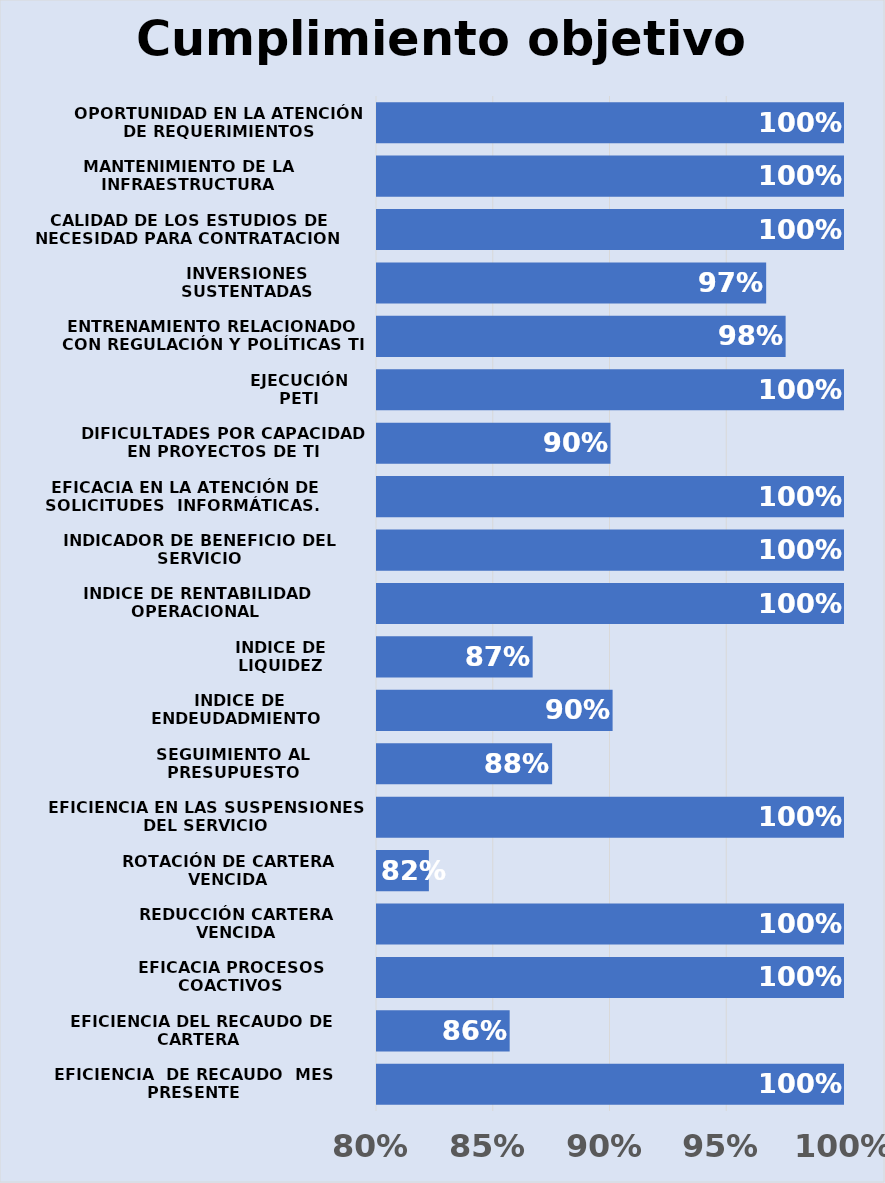
| Category | Series 0 |
|---|---|
| EFICIENCIA  DE RECAUDO  MES PRESENTE | 1 |
| EFICIENCIA DEL RECAUDO DE CARTERA  | 0.857 |
| EFICACIA PROCESOS COACTIVOS | 1 |
| REDUCCIÓN CARTERA VENCIDA | 1 |
| ROTACIÓN DE CARTERA VENCIDA | 0.822 |
| EFICIENCIA EN LAS SUSPENSIONES DEL SERVICIO | 1 |
| SEGUIMIENTO AL PRESUPUESTO | 0.875 |
| INDICE DE ENDEUDADMIENTO  | 0.901 |
| INDICE DE LIQUIDEZ | 0.867 |
| INDICE DE RENTABILIDAD OPERACIONAL  | 1 |
| INDICADOR DE BENEFICIO DEL SERVICIO | 1 |
| EFICACIA EN LA ATENCIÓN DE SOLICITUDES  INFORMÁTICAS.  | 1 |
| DIFICULTADES POR CAPACIDAD EN PROYECTOS DE TI | 0.9 |
| EJECUCIÓN PETI | 1 |
| ENTRENAMIENTO RELACIONADO CON REGULACIÓN Y POLÍTICAS TI | 0.975 |
| INVERSIONES SUSTENTADAS | 0.967 |
| CALIDAD DE LOS ESTUDIOS DE NECESIDAD PARA CONTRATACION | 1 |
| MANTENIMIENTO DE LA INFRAESTRUCTURA | 1 |
| OPORTUNIDAD EN LA ATENCIÓN DE REQUERIMIENTOS | 1 |